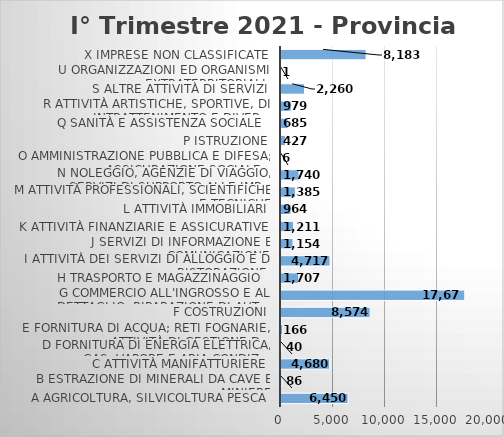
| Category | Series 0 |
|---|---|
| A Agricoltura, silvicoltura pesca | 6450 |
| B Estrazione di minerali da cave e miniere | 86 |
| C Attività manifatturiere | 4680 |
| D Fornitura di energia elettrica, gas, vapore e aria condiz... | 40 |
| E Fornitura di acqua; reti fognarie, attività di gestione d... | 166 |
| F Costruzioni | 8574 |
| G Commercio all'ingrosso e al dettaglio; riparazione di aut... | 17671 |
| H Trasporto e magazzinaggio  | 1707 |
| I Attività dei servizi di alloggio e di ristorazione  | 4717 |
| J Servizi di informazione e comunicazione | 1154 |
| K Attività finanziarie e assicurative | 1211 |
| L Attività immobiliari | 964 |
| M Attività professionali, scientifiche e tecniche | 1385 |
| N Noleggio, agenzie di viaggio, servizi di supporto alle imp... | 1740 |
| O Amministrazione pubblica e difesa; assicurazione sociale... | 6 |
| P Istruzione | 427 |
| Q Sanità e assistenza sociale   | 685 |
| R Attività artistiche, sportive, di intrattenimento e diver... | 979 |
| S Altre attività di servizi | 2260 |
| U Organizzazioni ed organismi extraterritoriali  | 1 |
| X Imprese non classificate | 8183 |